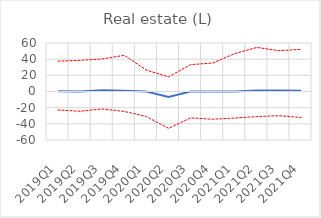
| Category | p25 | Median | p75 | Zero line |
|---|---|---|---|---|
| 2019Q1 | -22.793 | 0.242 | 37.5 | 0 |
| 2019Q2 | -24.444 | 0 | 38.545 | 0 |
| 2019Q3 | -21.566 | 1.438 | 40.249 | 0 |
| 2019Q4 | -24.657 | 1.055 | 44.811 | 0 |
| 2020Q1 | -31 | 0 | 26.449 | 0 |
| 2020Q2 | -45.551 | -6.747 | 18.069 | 0 |
| 2020Q3 | -32.63 | 0 | 33.229 | 0 |
| 2020Q4 | -34.328 | 0 | 35.242 | 0 |
| 2021Q1 | -32.849 | 0 | 46.847 | 0 |
| 2021Q2 | -31.012 | 1.144 | 54.522 | 0 |
| 2021Q3 | -29.938 | 1.274 | 50.532 | 0 |
| 2021Q4 | -32.18 | 0.927 | 52.11 | 0 |